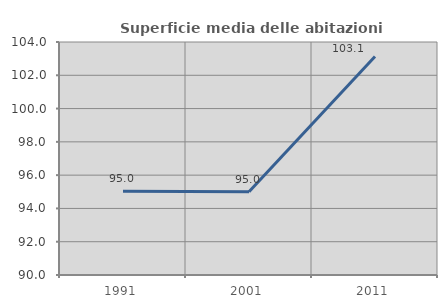
| Category | Superficie media delle abitazioni occupate |
|---|---|
| 1991.0 | 95.032 |
| 2001.0 | 95.004 |
| 2011.0 | 103.134 |